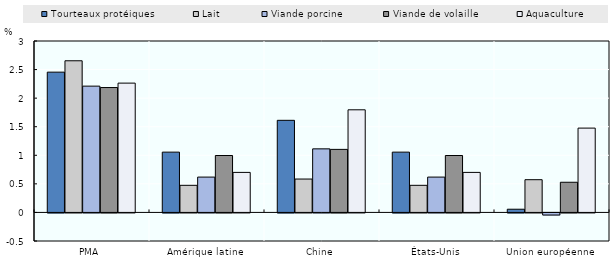
| Category | Tourteaux protéiques | Lait | Viande porcine | Viande de volaille | Aquaculture |
|---|---|---|---|---|---|
| PMA | 2.455 | 2.654 | 2.21 | 2.185 | 2.263 |
| Amérique latine | 1.055 | 0.474 | 0.619 | 0.996 | 0.701 |
| Chine | 1.612 | 0.584 | 1.112 | 1.103 | 1.796 |
| États-Unis | 1.055 | 0.474 | 0.619 | 0.996 | 0.701 |
| Union européenne | 0.056 | 0.573 | -0.037 | 0.528 | 1.476 |